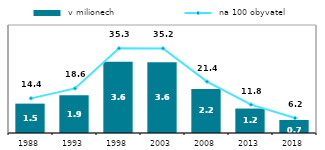
| Category |  v milionech |
|---|---|
| 1988.0 | 1.495 |
| 1993.0 | 1.919 |
| 1998.0 | 3.629 |
| 2003.0 | 3.598 |
| 2008.0 | 2.242 |
| 2013.0 | 1.245 |
| 2018.0 | 0.665 |